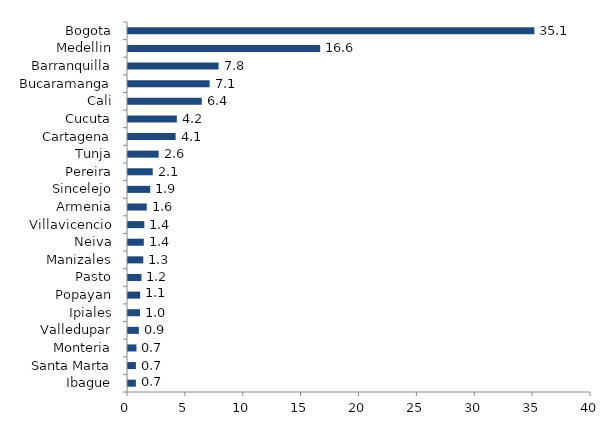
| Category | Series 0 |
|---|---|
| Ibague | 0.679 |
| Santa Marta | 0.682 |
| Monteria | 0.728 |
| Valledupar | 0.939 |
| Ipiales | 1.035 |
| Popayan | 1.052 |
| Pasto | 1.164 |
| Manizales | 1.319 |
| Neiva | 1.365 |
| Villavicencio | 1.412 |
| Armenia | 1.621 |
| Sincelejo | 1.921 |
| Pereira | 2.135 |
| Tunja | 2.647 |
| Cartagena | 4.115 |
| Cucuta | 4.219 |
| Cali | 6.375 |
| Bucaramanga | 7.053 |
| Barranquilla | 7.827 |
| Medellin | 16.602 |
| Bogota | 35.107 |